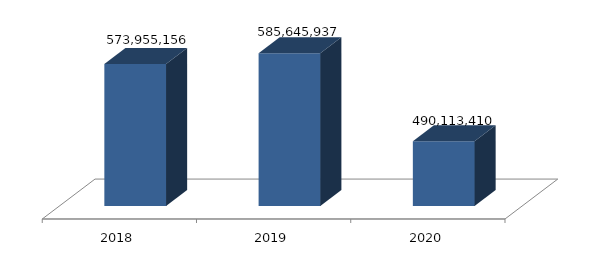
| Category | Series 0 |
|---|---|
| 0 | 573955156 |
| 1 | 585645937 |
| 2 | 490113410 |